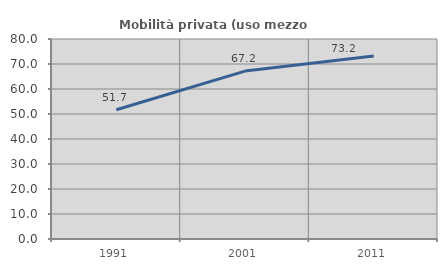
| Category | Mobilità privata (uso mezzo privato) |
|---|---|
| 1991.0 | 51.687 |
| 2001.0 | 67.164 |
| 2011.0 | 73.214 |